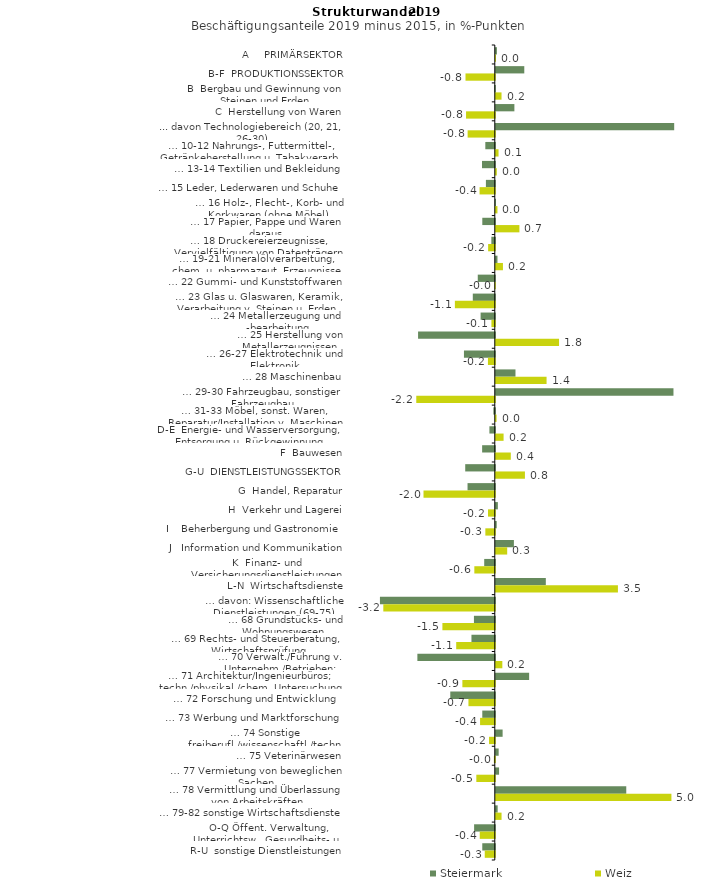
| Category | Steiermark | Weiz |
|---|---|---|
| A     PRIMÄRSEKTOR | 0.031 | 0.005 |
| B-F  PRODUKTIONSSEKTOR | 0.809 | -0.832 |
| B  Bergbau und Gewinnung von Steinen und Erden | -0.014 | 0.163 |
| C  Herstellung von Waren | 0.528 | -0.817 |
| ... davon Technologiebereich (20, 21, 26-30) | 5.068 | -0.772 |
| … 10-12 Nahrungs-, Futtermittel-, Getränkeherstellung u. Tabakverarb. | -0.269 | 0.078 |
| … 13-14 Textilien und Bekleidung | -0.363 | 0.029 |
| … 15 Leder, Lederwaren und Schuhe | -0.253 | -0.433 |
| … 16 Holz-, Flecht-, Korb- und Korkwaren (ohne Möbel)  | 0.005 | 0.047 |
| … 17 Papier, Pappe und Waren daraus  | -0.355 | 0.671 |
| … 18 Druckereierzeugnisse, Vervielfältigung von Datenträgern | -0.098 | -0.19 |
| … 19-21 Mineralölverarbeitung, chem. u. pharmazeut. Erzeugnisse | 0.048 | 0.203 |
| … 22 Gummi- und Kunststoffwaren | -0.484 | -0.009 |
| … 23 Glas u. Glaswaren, Keramik, Verarbeitung v. Steinen u. Erden  | -0.625 | -1.134 |
| … 24 Metallerzeugung und -bearbeitung | -0.403 | -0.096 |
| … 25 Herstellung von Metallerzeugnissen  | -2.18 | 1.797 |
| … 26-27 Elektrotechnik und Elektronik | -0.876 | -0.195 |
| … 28 Maschinenbau | 0.559 | 1.442 |
| … 29-30 Fahrzeugbau, sonstiger Fahrzeugbau | 5.047 | -2.231 |
| … 31-33 Möbel, sonst. Waren, Reparatur/Installation v. Maschinen | -0.041 | 0.022 |
| D-E  Energie- und Wasserversorgung, Entsorgung u. Rückgewinnung | -0.153 | 0.221 |
| F  Bauwesen | -0.36 | 0.426 |
| G-U  DIENSTLEISTUNGSSEKTOR | -0.84 | 0.828 |
| G  Handel, Reparatur | -0.775 | -2.025 |
| H  Verkehr und Lagerei | 0.059 | -0.193 |
| I    Beherbergung und Gastronomie | 0.026 | -0.268 |
| J   Information und Kommunikation | 0.514 | 0.324 |
| K  Finanz- und Versicherungsdienstleistungen | -0.301 | -0.581 |
| L-N  Wirtschaftsdienste | 1.421 | 3.469 |
| … davon: Wissenschaftliche Dienstleistungen (69-75) | -3.263 | -3.167 |
| … 68 Grundstücks- und Wohnungswesen  | -0.593 | -1.488 |
| … 69 Rechts- und Steuerberatung, Wirtschaftsprüfung | -0.663 | -1.096 |
| … 70 Verwalt./Führung v. Unternehm./Betrieben; Unternehmensberat. | -2.199 | 0.186 |
| … 71 Architektur/Ingenieurbüros; techn./physikal./chem. Untersuchung | 0.947 | -0.921 |
| … 72 Forschung und Entwicklung  | -1.265 | -0.749 |
| … 73 Werbung und Marktforschung | -0.356 | -0.418 |
| … 74 Sonstige freiberufl./wissenschaftl./techn. Tätigkeiten | 0.194 | -0.164 |
| … 75 Veterinärwesen | 0.081 | -0.026 |
| … 77 Vermietung von beweglichen Sachen  | 0.093 | -0.525 |
| … 78 Vermittlung und Überlassung von Arbeitskräften | 3.706 | 4.989 |
| … 79-82 sonstige Wirtschaftsdienste | 0.053 | 0.163 |
| O-Q Öffent. Verwaltung, Unterrichtsw., Gesundheits- u. Sozialwesen | -0.588 | -0.428 |
| R-U  sonstige Dienstleistungen | -0.356 | -0.286 |